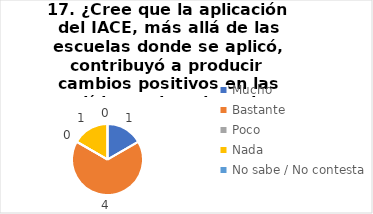
| Category | 17. ¿Cree que la aplicación del IACE, más allá de las escuelas donde se aplicó, contribuyó a producir cambios positivos en las políticas educativas de su provincia? |
|---|---|
| Mucho  | 0.167 |
| Bastante  | 0.667 |
| Poco  | 0 |
| Nada  | 0.167 |
| No sabe / No contesta | 0 |